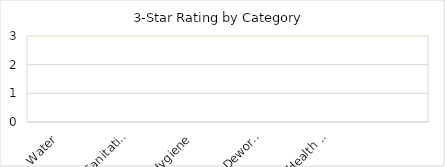
| Category | Series 0 |
|---|---|
| Water | 0 |
| Sanitation | 0 |
| Hygiene | 0 |
| Deworming | 0 |
| Health Education | 0 |